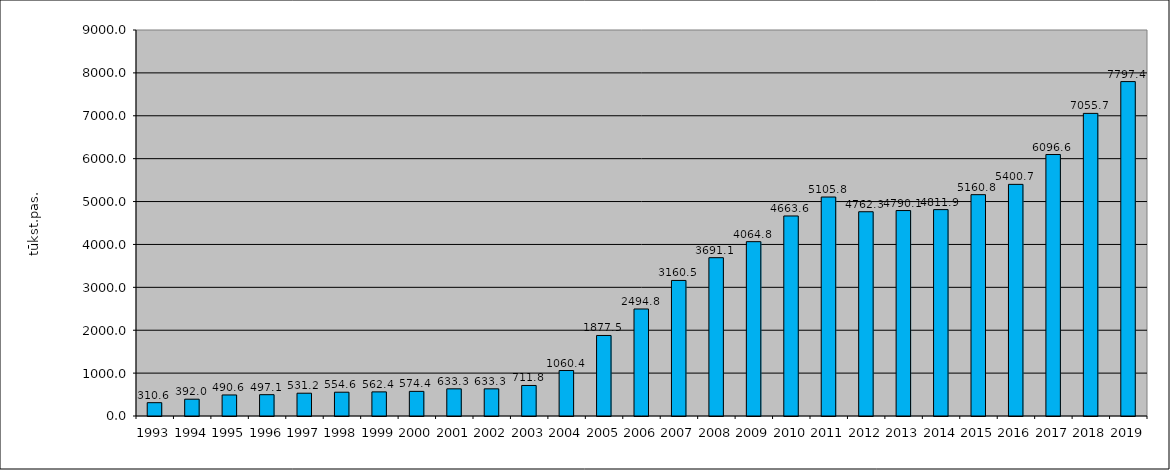
| Category | Series 1 |
|---|---|
| 1993.0 | 310.6 |
| 1994.0 | 392 |
| 1995.0 | 490.62 |
| 1996.0 | 497.13 |
| 1997.0 | 531.22 |
| 1998.0 | 554.62 |
| 1999.0 | 562.383 |
| 2000.0 | 574.356 |
| 2001.0 | 633.319 |
| 2002.0 | 633.319 |
| 2003.0 | 711.848 |
| 2004.0 | 1060.384 |
| 2005.0 | 1877.461 |
| 2006.0 | 2494.835 |
| 2007.0 | 3160.535 |
| 2008.0 | 3691.099 |
| 2009.0 | 4064.755 |
| 2010.0 | 4663.647 |
| 2011.0 | 5105.818 |
| 2012.0 | 4762.335 |
| 2013.0 | 4790.136 |
| 2014.0 | 4811.949 |
| 2015.0 | 5160.759 |
| 2016.0 | 5400.709 |
| 2017.0 | 6096.62 |
| 2018.0 | 7055.734 |
| 2019.0 | 7797.398 |